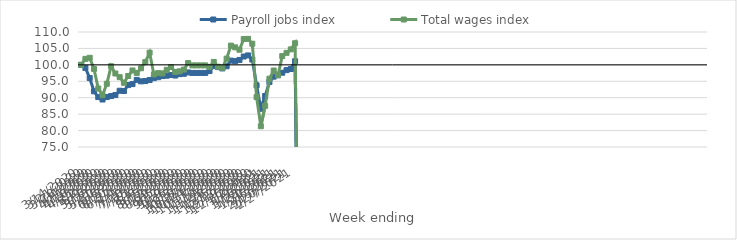
| Category | Payroll jobs index | Total wages index |
|---|---|---|
| 14/03/2020 | 100 | 100 |
| 21/03/2020 | 99.063 | 101.825 |
| 28/03/2020 | 95.988 | 102.152 |
| 04/04/2020 | 91.947 | 98.767 |
| 11/04/2020 | 90.192 | 92.796 |
| 18/04/2020 | 89.45 | 90.77 |
| 25/04/2020 | 90.199 | 94.243 |
| 02/05/2020 | 90.503 | 99.578 |
| 09/05/2020 | 90.803 | 97.374 |
| 16/05/2020 | 92.122 | 96.256 |
| 23/05/2020 | 92.04 | 94.541 |
| 30/05/2020 | 93.848 | 96.606 |
| 06/06/2020 | 94.142 | 98.293 |
| 13/06/2020 | 95.432 | 97.55 |
| 20/06/2020 | 94.981 | 98.965 |
| 27/06/2020 | 95.066 | 100.842 |
| 04/07/2020 | 95.379 | 103.71 |
| 11/07/2020 | 95.96 | 97.078 |
| 18/07/2020 | 96.252 | 97.497 |
| 25/07/2020 | 96.592 | 97.402 |
| 01/08/2020 | 96.695 | 98.489 |
| 08/08/2020 | 96.927 | 99.327 |
| 15/08/2020 | 96.751 | 97.846 |
| 22/08/2020 | 97.172 | 98.022 |
| 29/08/2020 | 97.282 | 98.566 |
| 05/09/2020 | 97.691 | 100.539 |
| 12/09/2020 | 97.548 | 99.834 |
| 19/09/2020 | 97.548 | 99.834 |
| 26/09/2020 | 97.548 | 99.834 |
| 03/10/2020 | 97.548 | 99.834 |
| 10/10/2020 | 98.109 | 99.372 |
| 17/10/2020 | 99.616 | 100.891 |
| 24/10/2020 | 99.31 | 99.432 |
| 31/10/2020 | 98.909 | 99.086 |
| 07/11/2020 | 99.562 | 101.89 |
| 14/11/2020 | 101.299 | 105.854 |
| 21/11/2020 | 101.133 | 105.33 |
| 28/11/2020 | 101.493 | 104.595 |
| 05/12/2020 | 102.536 | 107.857 |
| 12/12/2020 | 102.871 | 107.916 |
| 19/12/2020 | 101.613 | 106.434 |
| 26/12/2020 | 93.766 | 90.2 |
| 02/01/2021 | 86.624 | 81.316 |
| 09/01/2021 | 90.52 | 87.518 |
| 16/01/2021 | 94.758 | 95.786 |
| 23/01/2021 | 96.417 | 98.276 |
| 30/01/2021 | 96.858 | 96.846 |
| 06/02/2021 | 97.604 | 102.659 |
| 13/02/2021 | 98.396 | 103.653 |
| 20/02/2021 | 98.731 | 104.716 |
| 27/02/2021 | 101.119 | 106.579 |